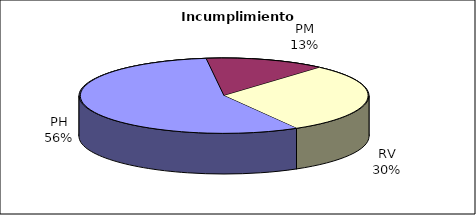
| Category | Valores |
|---|---|
| PH | 297 |
| PM | 71 |
| RV | 159 |